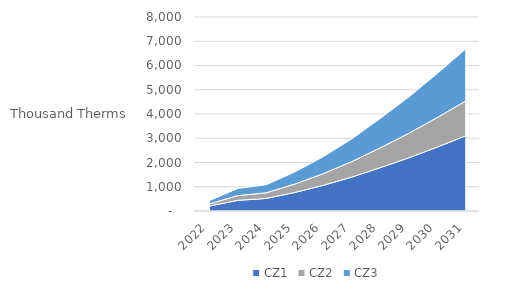
| Category | CZ1 | CZ2 | CZ3 |
|---|---|---|---|
| 2022.0 | 203.103 | 89.713 | 133.526 |
| 2023.0 | 439.059 | 195.978 | 292.184 |
| 2024.0 | 517.703 | 233.712 | 330.986 |
| 2025.0 | 764.553 | 346.069 | 497.713 |
| 2026.0 | 1059.052 | 481.412 | 699.705 |
| 2027.0 | 1397.834 | 638.415 | 935.702 |
| 2028.0 | 1786.533 | 819.612 | 1209.344 |
| 2029.0 | 2192.199 | 1009.854 | 1497.667 |
| 2030.0 | 2637.052 | 1218.837 | 1814.205 |
| 2031.0 | 3100.534 | 1436.757 | 2144.198 |